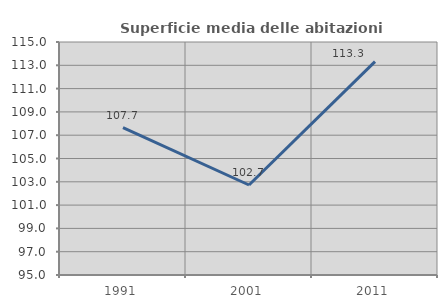
| Category | Superficie media delle abitazioni occupate |
|---|---|
| 1991.0 | 107.656 |
| 2001.0 | 102.725 |
| 2011.0 | 113.312 |